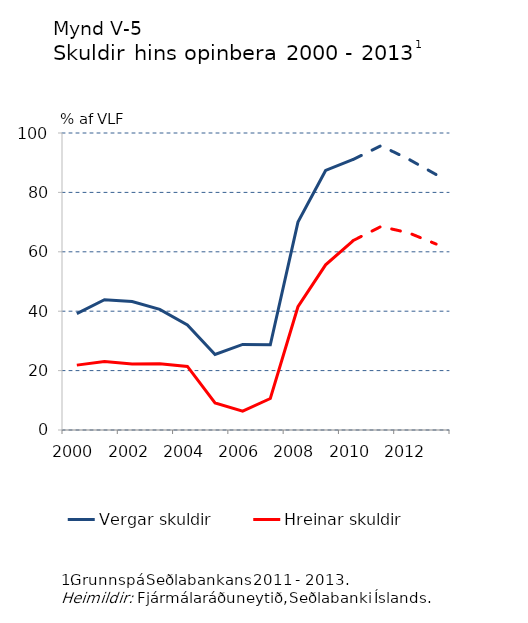
| Category | Vergar skuldir |
|---|---|
| 2000.0 | 39.211 |
| 2001.0 | 43.879 |
| 2002.0 | 43.252 |
| 2003.0 | 40.629 |
| 2004.0 | 35.399 |
| 2005.0 | 25.414 |
| 2006.0 | 28.803 |
| 2007.0 | 28.7 |
| 2008.0 | 70 |
| 2009.0 | 87.4 |
| 2010.0 | 91.1 |
| 2011.0 | 95.7 |
| 2012.0 | 91.2 |
| 2013.0 | 86 |